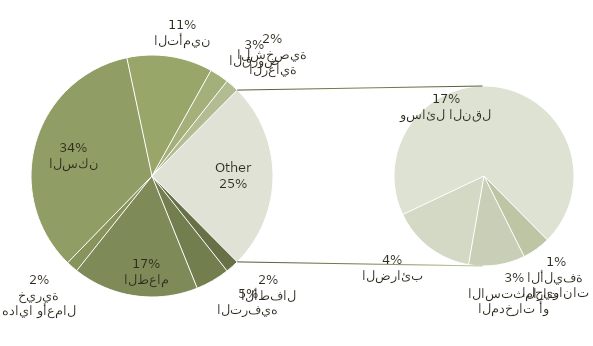
| Category | Total |
|---|---|
| الأطفال | 140 |
| الترفيه | 358 |
| الطعام | 1320 |
| هدايا وأعمال خيرية | 125 |
| السكن | 2702 |
| التأمين | 900 |
| القروض | 200 |
| الرعاية الشخصية | 140 |
| الحيوانات الأليفة | 100 |
| المدخرات أو الاستثمارات | 200 |
| الضرائب | 300 |
| وسائل النقل | 1375 |